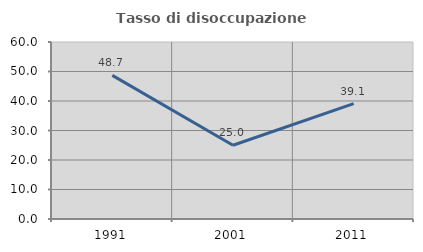
| Category | Tasso di disoccupazione giovanile  |
|---|---|
| 1991.0 | 48.684 |
| 2001.0 | 25 |
| 2011.0 | 39.13 |